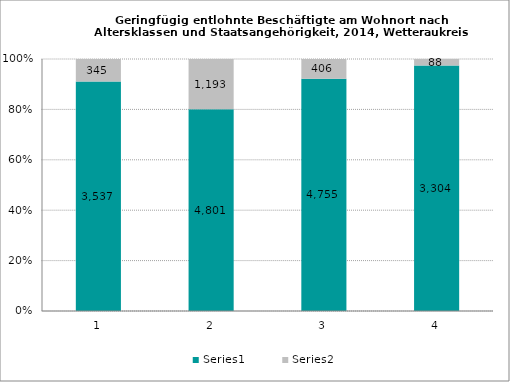
| Category | Series 0 | Series 1 |
|---|---|---|
| 0 | 3537 | 345 |
| 1 | 4801 | 1193 |
| 2 | 4755 | 406 |
| 3 | 3304 | 88 |